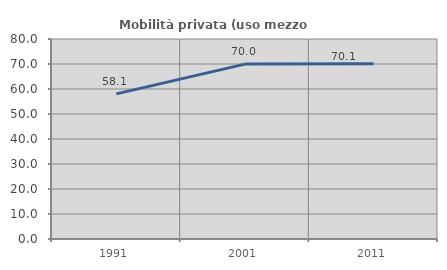
| Category | Mobilità privata (uso mezzo privato) |
|---|---|
| 1991.0 | 58.065 |
| 2001.0 | 69.965 |
| 2011.0 | 70.132 |